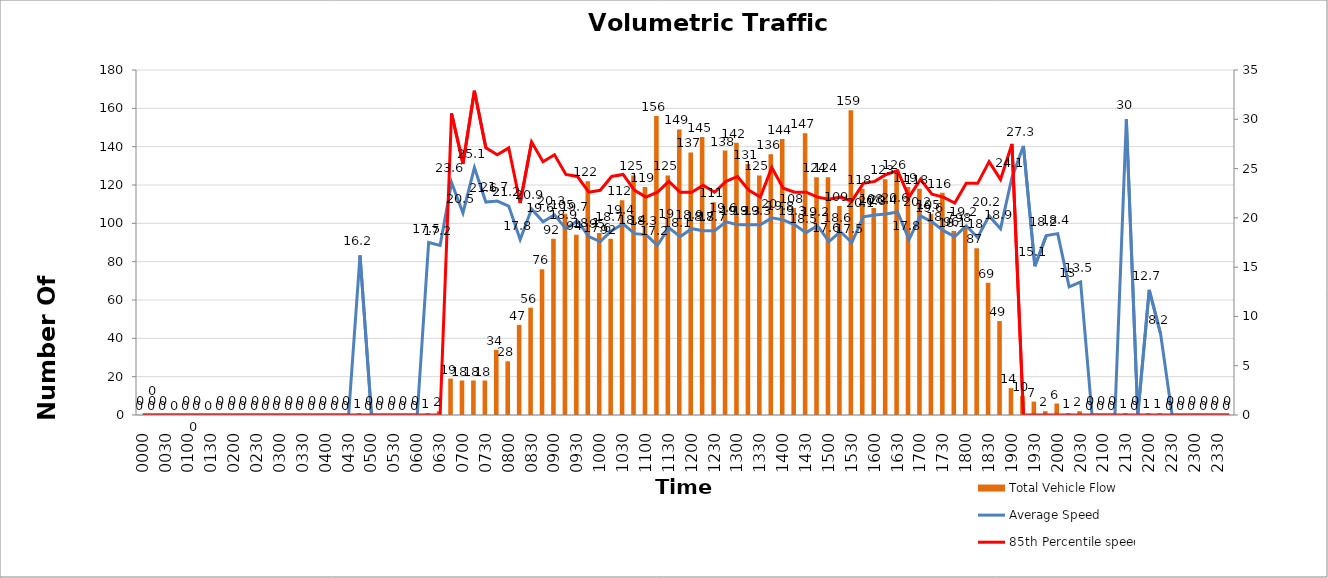
| Category | Total Vehicle Flow |
|---|---|
| 0000 | 0 |
| 0015 | 0 |
| 0030 | 0 |
| 0045 | 0 |
| 0100 | 0 |
| 0115 | 0 |
| 0130 | 0 |
| 0145 | 0 |
| 0200 | 0 |
| 0215 | 0 |
| 0230 | 0 |
| 0245 | 0 |
| 0300 | 0 |
| 0315 | 0 |
| 0330 | 0 |
| 0345 | 0 |
| 0400 | 0 |
| 0415 | 0 |
| 0430 | 0 |
| 0445 | 1 |
| 0500 | 0 |
| 0515 | 0 |
| 0530 | 0 |
| 0545 | 0 |
| 0600 | 0 |
| 0615 | 1 |
| 0630 | 2 |
| 0645 | 19 |
| 0700 | 18 |
| 0715 | 18 |
| 0730 | 18 |
| 0745 | 34 |
| 0800 | 28 |
| 0815 | 47 |
| 0830 | 56 |
| 0845 | 76 |
| 0900 | 92 |
| 0915 | 105 |
| 0930 | 94 |
| 0945 | 122 |
| 1000 | 95 |
| 1015 | 92 |
| 1030 | 112 |
| 1045 | 125 |
| 1100 | 119 |
| 1115 | 156 |
| 1130 | 125 |
| 1145 | 149 |
| 1200 | 137 |
| 1215 | 145 |
| 1230 | 111 |
| 1245 | 138 |
| 1300 | 142 |
| 1315 | 131 |
| 1330 | 125 |
| 1345 | 136 |
| 1400 | 144 |
| 1415 | 108 |
| 1430 | 147 |
| 1445 | 124 |
| 1500 | 124 |
| 1515 | 109 |
| 1530 | 159 |
| 1545 | 118 |
| 1600 | 108 |
| 1615 | 123 |
| 1630 | 126 |
| 1645 | 119 |
| 1700 | 118 |
| 1715 | 105 |
| 1730 | 116 |
| 1745 | 96 |
| 1800 | 98 |
| 1815 | 87 |
| 1830 | 69 |
| 1845 | 49 |
| 1900 | 14 |
| 1915 | 10 |
| 1930 | 7 |
| 1945 | 2 |
| 2000 | 6 |
| 2015 | 1 |
| 2030 | 2 |
| 2045 | 0 |
| 2100 | 0 |
| 2115 | 0 |
| 2130 | 1 |
| 2145 | 0 |
| 2200 | 1 |
| 2215 | 1 |
| 2230 | 0 |
| 2245 | 0 |
| 2300 | 0 |
| 2315 | 0 |
| 2330 | 0 |
| 2345 | 0 |